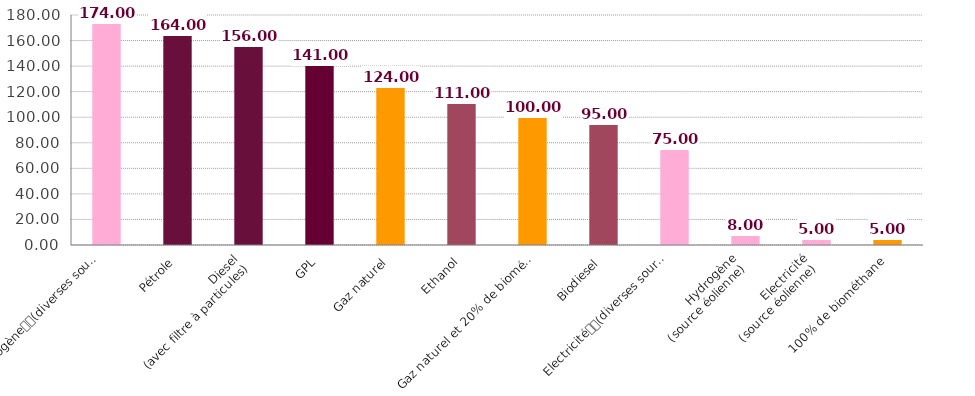
| Category | Series 0 |
|---|---|
| Hydrogène
(diverses sources d'énergie) | 174 |
| Pétrole | 164 |
| Diesel
(avec filtre à particules) | 156 |
| GPL | 141 |
| Gaz naturel | 124 |
| Ethanol | 111 |
| Gaz naturel et 20% de biométhane | 100 |
| Biodiesel | 95 |
| Electricité
(diverses sources d'énergie) | 75 |
| Hydrogène
(source éolienne) | 8 |
| Electricité
(source éolienne) | 5 |
| 100% de biométhane | 5 |